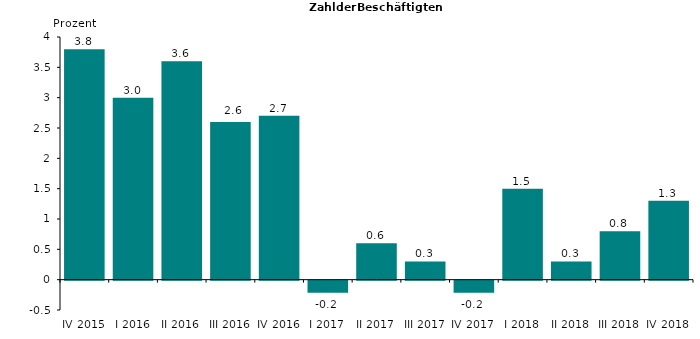
| Category | 3,8 3,0 3,6 2,6 2,7 -0,2 0,6 0,3 -0,2 1,5 0,3 0,8 1,3 |
|---|---|
| IV 2015 | 3.8 |
| I 2016 | 3 |
| II 2016 | 3.6 |
| III 2016 | 2.6 |
| IV 2016 | 2.7 |
| I 2017 | -0.2 |
| II 2017 | 0.6 |
| III 2017 | 0.3 |
| IV 2017 | -0.2 |
| I 2018 | 1.5 |
| II 2018 | 0.3 |
| III 2018 | 0.8 |
| IV 2018 | 1.3 |